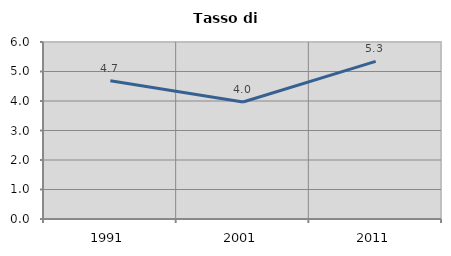
| Category | Tasso di disoccupazione   |
|---|---|
| 1991.0 | 4.69 |
| 2001.0 | 3.965 |
| 2011.0 | 5.342 |